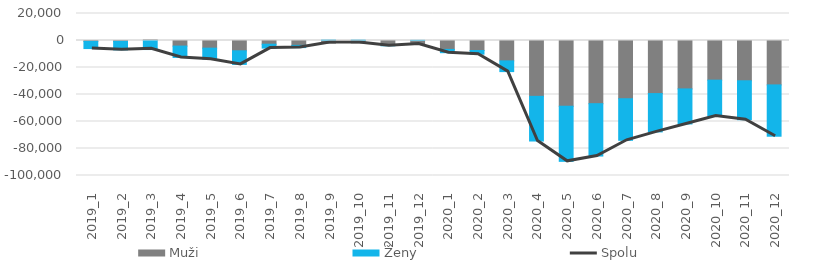
| Category | Muži | Ženy |
|---|---|---|
| 2019_1 | -616 | -5351 |
| 2019_2 | -613 | -6323 |
| 2019_3 | 492 | -6696 |
| 2019_4 | -4144 | -8398 |
| 2019_5 | -5674 | -8212 |
| 2019_6 | -7641 | -10061 |
| 2019_7 | -2743 | -2878 |
| 2019_8 | -3616 | -1634 |
| 2019_9 | -1936 | 403 |
| 2019_10 | -1797 | 355 |
| 2019_11 | -3202 | -731 |
| 2019_12 | -2786 | 161 |
| 2020_1 | -6588 | -2439 |
| 2020_2 | -7411 | -2705 |
| 2020_3 | -15112 | -7924 |
| 2020_4 | -41371 | -33082 |
| 2020_5 | -48690 | -40828 |
| 2020_6 | -46789 | -38796 |
| 2020_7 | -43141 | -30780 |
| 2020_8 | -39309 | -28407 |
| 2020_9 | -35869 | -25959 |
| 2020_10 | -29374 | -26621 |
| 2020_11 | -29840 | -28817 |
| 2020_12 | -32898 | -38011 |